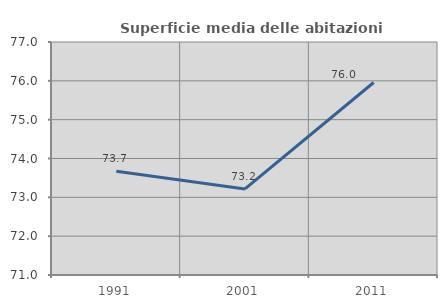
| Category | Superficie media delle abitazioni occupate |
|---|---|
| 1991.0 | 73.673 |
| 2001.0 | 73.216 |
| 2011.0 | 75.957 |